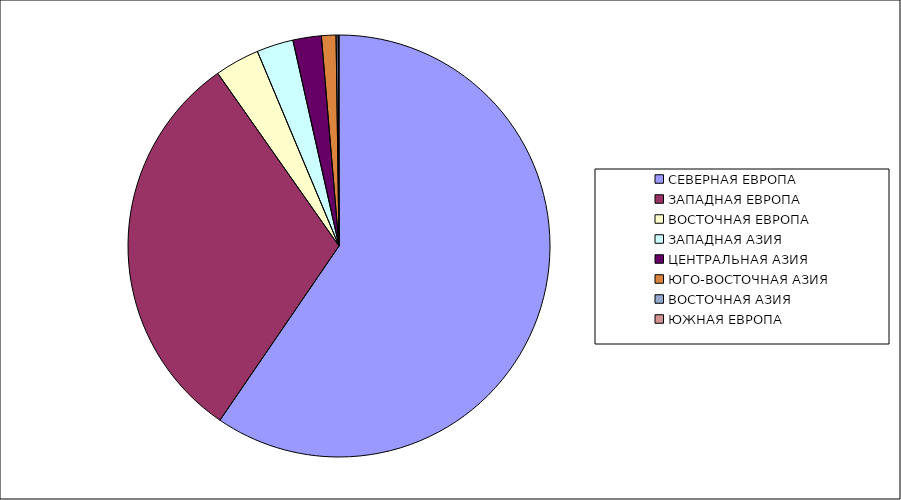
| Category | Оборот |
|---|---|
| СЕВЕРНАЯ ЕВРОПА | 59.54 |
| ЗАПАДНАЯ ЕВРОПА | 30.715 |
| ВОСТОЧНАЯ ЕВРОПА | 3.424 |
| ЗАПАДНАЯ АЗИЯ | 2.81 |
| ЦЕНТРАЛЬНАЯ АЗИЯ | 2.175 |
| ЮГО-ВОСТОЧНАЯ АЗИЯ | 1.113 |
| ВОСТОЧНАЯ АЗИЯ | 0.158 |
| ЮЖНАЯ ЕВРОПА | 0.064 |